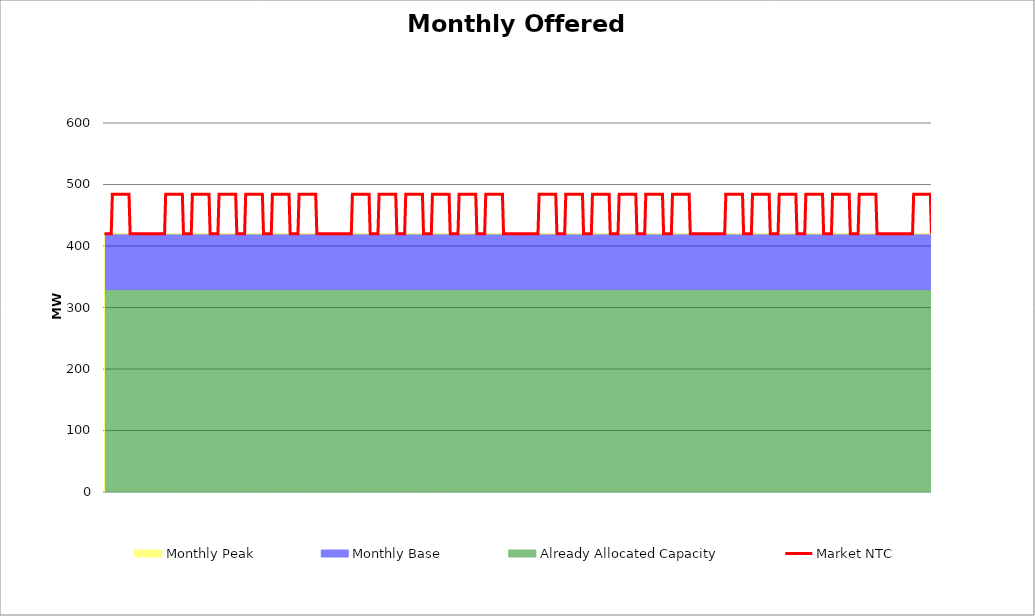
| Category | Market NTC |
|---|---|
| 0 | 420 |
| 1 | 420 |
| 2 | 420 |
| 3 | 420 |
| 4 | 420 |
| 5 | 420 |
| 6 | 420 |
| 7 | 484 |
| 8 | 484 |
| 9 | 484 |
| 10 | 484 |
| 11 | 484 |
| 12 | 484 |
| 13 | 484 |
| 14 | 484 |
| 15 | 484 |
| 16 | 484 |
| 17 | 484 |
| 18 | 484 |
| 19 | 484 |
| 20 | 484 |
| 21 | 484 |
| 22 | 484 |
| 23 | 420 |
| 24 | 420 |
| 25 | 420 |
| 26 | 420 |
| 27 | 420 |
| 28 | 420 |
| 29 | 420 |
| 30 | 420 |
| 31 | 420 |
| 32 | 420 |
| 33 | 420 |
| 34 | 420 |
| 35 | 420 |
| 36 | 420 |
| 37 | 420 |
| 38 | 420 |
| 39 | 420 |
| 40 | 420 |
| 41 | 420 |
| 42 | 420 |
| 43 | 420 |
| 44 | 420 |
| 45 | 420 |
| 46 | 420 |
| 47 | 420 |
| 48 | 420 |
| 49 | 420 |
| 50 | 420 |
| 51 | 420 |
| 52 | 420 |
| 53 | 420 |
| 54 | 420 |
| 55 | 484 |
| 56 | 484 |
| 57 | 484 |
| 58 | 484 |
| 59 | 484 |
| 60 | 484 |
| 61 | 484 |
| 62 | 484 |
| 63 | 484 |
| 64 | 484 |
| 65 | 484 |
| 66 | 484 |
| 67 | 484 |
| 68 | 484 |
| 69 | 484 |
| 70 | 484 |
| 71 | 420 |
| 72 | 420 |
| 73 | 420 |
| 74 | 420 |
| 75 | 420 |
| 76 | 420 |
| 77 | 420 |
| 78 | 420 |
| 79 | 484 |
| 80 | 484 |
| 81 | 484 |
| 82 | 484 |
| 83 | 484 |
| 84 | 484 |
| 85 | 484 |
| 86 | 484 |
| 87 | 484 |
| 88 | 484 |
| 89 | 484 |
| 90 | 484 |
| 91 | 484 |
| 92 | 484 |
| 93 | 484 |
| 94 | 484 |
| 95 | 420 |
| 96 | 420 |
| 97 | 420 |
| 98 | 420 |
| 99 | 420 |
| 100 | 420 |
| 101 | 420 |
| 102 | 420 |
| 103 | 484 |
| 104 | 484 |
| 105 | 484 |
| 106 | 484 |
| 107 | 484 |
| 108 | 484 |
| 109 | 484 |
| 110 | 484 |
| 111 | 484 |
| 112 | 484 |
| 113 | 484 |
| 114 | 484 |
| 115 | 484 |
| 116 | 484 |
| 117 | 484 |
| 118 | 484 |
| 119 | 420 |
| 120 | 420 |
| 121 | 420 |
| 122 | 420 |
| 123 | 420 |
| 124 | 420 |
| 125 | 420 |
| 126 | 420 |
| 127 | 484 |
| 128 | 484 |
| 129 | 484 |
| 130 | 484 |
| 131 | 484 |
| 132 | 484 |
| 133 | 484 |
| 134 | 484 |
| 135 | 484 |
| 136 | 484 |
| 137 | 484 |
| 138 | 484 |
| 139 | 484 |
| 140 | 484 |
| 141 | 484 |
| 142 | 484 |
| 143 | 420 |
| 144 | 420 |
| 145 | 420 |
| 146 | 420 |
| 147 | 420 |
| 148 | 420 |
| 149 | 420 |
| 150 | 420 |
| 151 | 484 |
| 152 | 484 |
| 153 | 484 |
| 154 | 484 |
| 155 | 484 |
| 156 | 484 |
| 157 | 484 |
| 158 | 484 |
| 159 | 484 |
| 160 | 484 |
| 161 | 484 |
| 162 | 484 |
| 163 | 484 |
| 164 | 484 |
| 165 | 484 |
| 166 | 484 |
| 167 | 420 |
| 168 | 420 |
| 169 | 420 |
| 170 | 420 |
| 171 | 420 |
| 172 | 420 |
| 173 | 420 |
| 174 | 420 |
| 175 | 484 |
| 176 | 484 |
| 177 | 484 |
| 178 | 484 |
| 179 | 484 |
| 180 | 484 |
| 181 | 484 |
| 182 | 484 |
| 183 | 484 |
| 184 | 484 |
| 185 | 484 |
| 186 | 484 |
| 187 | 484 |
| 188 | 484 |
| 189 | 484 |
| 190 | 484 |
| 191 | 420 |
| 192 | 420 |
| 193 | 420 |
| 194 | 420 |
| 195 | 420 |
| 196 | 420 |
| 197 | 420 |
| 198 | 420 |
| 199 | 420 |
| 200 | 420 |
| 201 | 420 |
| 202 | 420 |
| 203 | 420 |
| 204 | 420 |
| 205 | 420 |
| 206 | 420 |
| 207 | 420 |
| 208 | 420 |
| 209 | 420 |
| 210 | 420 |
| 211 | 420 |
| 212 | 420 |
| 213 | 420 |
| 214 | 420 |
| 215 | 420 |
| 216 | 420 |
| 217 | 420 |
| 218 | 420 |
| 219 | 420 |
| 220 | 420 |
| 221 | 420 |
| 222 | 420 |
| 223 | 484 |
| 224 | 484 |
| 225 | 484 |
| 226 | 484 |
| 227 | 484 |
| 228 | 484 |
| 229 | 484 |
| 230 | 484 |
| 231 | 484 |
| 232 | 484 |
| 233 | 484 |
| 234 | 484 |
| 235 | 484 |
| 236 | 484 |
| 237 | 484 |
| 238 | 484 |
| 239 | 420 |
| 240 | 420 |
| 241 | 420 |
| 242 | 420 |
| 243 | 420 |
| 244 | 420 |
| 245 | 420 |
| 246 | 420 |
| 247 | 484 |
| 248 | 484 |
| 249 | 484 |
| 250 | 484 |
| 251 | 484 |
| 252 | 484 |
| 253 | 484 |
| 254 | 484 |
| 255 | 484 |
| 256 | 484 |
| 257 | 484 |
| 258 | 484 |
| 259 | 484 |
| 260 | 484 |
| 261 | 484 |
| 262 | 484 |
| 263 | 420 |
| 264 | 420 |
| 265 | 420 |
| 266 | 420 |
| 267 | 420 |
| 268 | 420 |
| 269 | 420 |
| 270 | 420 |
| 271 | 484 |
| 272 | 484 |
| 273 | 484 |
| 274 | 484 |
| 275 | 484 |
| 276 | 484 |
| 277 | 484 |
| 278 | 484 |
| 279 | 484 |
| 280 | 484 |
| 281 | 484 |
| 282 | 484 |
| 283 | 484 |
| 284 | 484 |
| 285 | 484 |
| 286 | 484 |
| 287 | 420 |
| 288 | 420 |
| 289 | 420 |
| 290 | 420 |
| 291 | 420 |
| 292 | 420 |
| 293 | 420 |
| 294 | 420 |
| 295 | 484 |
| 296 | 484 |
| 297 | 484 |
| 298 | 484 |
| 299 | 484 |
| 300 | 484 |
| 301 | 484 |
| 302 | 484 |
| 303 | 484 |
| 304 | 484 |
| 305 | 484 |
| 306 | 484 |
| 307 | 484 |
| 308 | 484 |
| 309 | 484 |
| 310 | 484 |
| 311 | 420 |
| 312 | 420 |
| 313 | 420 |
| 314 | 420 |
| 315 | 420 |
| 316 | 420 |
| 317 | 420 |
| 318 | 420 |
| 319 | 484 |
| 320 | 484 |
| 321 | 484 |
| 322 | 484 |
| 323 | 484 |
| 324 | 484 |
| 325 | 484 |
| 326 | 484 |
| 327 | 484 |
| 328 | 484 |
| 329 | 484 |
| 330 | 484 |
| 331 | 484 |
| 332 | 484 |
| 333 | 484 |
| 334 | 484 |
| 335 | 420 |
| 336 | 420 |
| 337 | 420 |
| 338 | 420 |
| 339 | 420 |
| 340 | 420 |
| 341 | 420 |
| 342 | 420 |
| 343 | 484 |
| 344 | 484 |
| 345 | 484 |
| 346 | 484 |
| 347 | 484 |
| 348 | 484 |
| 349 | 484 |
| 350 | 484 |
| 351 | 484 |
| 352 | 484 |
| 353 | 484 |
| 354 | 484 |
| 355 | 484 |
| 356 | 484 |
| 357 | 484 |
| 358 | 484 |
| 359 | 420 |
| 360 | 420 |
| 361 | 420 |
| 362 | 420 |
| 363 | 420 |
| 364 | 420 |
| 365 | 420 |
| 366 | 420 |
| 367 | 420 |
| 368 | 420 |
| 369 | 420 |
| 370 | 420 |
| 371 | 420 |
| 372 | 420 |
| 373 | 420 |
| 374 | 420 |
| 375 | 420 |
| 376 | 420 |
| 377 | 420 |
| 378 | 420 |
| 379 | 420 |
| 380 | 420 |
| 381 | 420 |
| 382 | 420 |
| 383 | 420 |
| 384 | 420 |
| 385 | 420 |
| 386 | 420 |
| 387 | 420 |
| 388 | 420 |
| 389 | 420 |
| 390 | 420 |
| 391 | 484 |
| 392 | 484 |
| 393 | 484 |
| 394 | 484 |
| 395 | 484 |
| 396 | 484 |
| 397 | 484 |
| 398 | 484 |
| 399 | 484 |
| 400 | 484 |
| 401 | 484 |
| 402 | 484 |
| 403 | 484 |
| 404 | 484 |
| 405 | 484 |
| 406 | 484 |
| 407 | 420 |
| 408 | 420 |
| 409 | 420 |
| 410 | 420 |
| 411 | 420 |
| 412 | 420 |
| 413 | 420 |
| 414 | 420 |
| 415 | 484 |
| 416 | 484 |
| 417 | 484 |
| 418 | 484 |
| 419 | 484 |
| 420 | 484 |
| 421 | 484 |
| 422 | 484 |
| 423 | 484 |
| 424 | 484 |
| 425 | 484 |
| 426 | 484 |
| 427 | 484 |
| 428 | 484 |
| 429 | 484 |
| 430 | 484 |
| 431 | 420 |
| 432 | 420 |
| 433 | 420 |
| 434 | 420 |
| 435 | 420 |
| 436 | 420 |
| 437 | 420 |
| 438 | 420 |
| 439 | 484 |
| 440 | 484 |
| 441 | 484 |
| 442 | 484 |
| 443 | 484 |
| 444 | 484 |
| 445 | 484 |
| 446 | 484 |
| 447 | 484 |
| 448 | 484 |
| 449 | 484 |
| 450 | 484 |
| 451 | 484 |
| 452 | 484 |
| 453 | 484 |
| 454 | 484 |
| 455 | 420 |
| 456 | 420 |
| 457 | 420 |
| 458 | 420 |
| 459 | 420 |
| 460 | 420 |
| 461 | 420 |
| 462 | 420 |
| 463 | 484 |
| 464 | 484 |
| 465 | 484 |
| 466 | 484 |
| 467 | 484 |
| 468 | 484 |
| 469 | 484 |
| 470 | 484 |
| 471 | 484 |
| 472 | 484 |
| 473 | 484 |
| 474 | 484 |
| 475 | 484 |
| 476 | 484 |
| 477 | 484 |
| 478 | 484 |
| 479 | 420 |
| 480 | 420 |
| 481 | 420 |
| 482 | 420 |
| 483 | 420 |
| 484 | 420 |
| 485 | 420 |
| 486 | 420 |
| 487 | 484 |
| 488 | 484 |
| 489 | 484 |
| 490 | 484 |
| 491 | 484 |
| 492 | 484 |
| 493 | 484 |
| 494 | 484 |
| 495 | 484 |
| 496 | 484 |
| 497 | 484 |
| 498 | 484 |
| 499 | 484 |
| 500 | 484 |
| 501 | 484 |
| 502 | 484 |
| 503 | 420 |
| 504 | 420 |
| 505 | 420 |
| 506 | 420 |
| 507 | 420 |
| 508 | 420 |
| 509 | 420 |
| 510 | 420 |
| 511 | 484 |
| 512 | 484 |
| 513 | 484 |
| 514 | 484 |
| 515 | 484 |
| 516 | 484 |
| 517 | 484 |
| 518 | 484 |
| 519 | 484 |
| 520 | 484 |
| 521 | 484 |
| 522 | 484 |
| 523 | 484 |
| 524 | 484 |
| 525 | 484 |
| 526 | 484 |
| 527 | 420 |
| 528 | 420 |
| 529 | 420 |
| 530 | 420 |
| 531 | 420 |
| 532 | 420 |
| 533 | 420 |
| 534 | 420 |
| 535 | 420 |
| 536 | 420 |
| 537 | 420 |
| 538 | 420 |
| 539 | 420 |
| 540 | 420 |
| 541 | 420 |
| 542 | 420 |
| 543 | 420 |
| 544 | 420 |
| 545 | 420 |
| 546 | 420 |
| 547 | 420 |
| 548 | 420 |
| 549 | 420 |
| 550 | 420 |
| 551 | 420 |
| 552 | 420 |
| 553 | 420 |
| 554 | 420 |
| 555 | 420 |
| 556 | 420 |
| 557 | 420 |
| 558 | 420 |
| 559 | 484 |
| 560 | 484 |
| 561 | 484 |
| 562 | 484 |
| 563 | 484 |
| 564 | 484 |
| 565 | 484 |
| 566 | 484 |
| 567 | 484 |
| 568 | 484 |
| 569 | 484 |
| 570 | 484 |
| 571 | 484 |
| 572 | 484 |
| 573 | 484 |
| 574 | 484 |
| 575 | 420 |
| 576 | 420 |
| 577 | 420 |
| 578 | 420 |
| 579 | 420 |
| 580 | 420 |
| 581 | 420 |
| 582 | 420 |
| 583 | 484 |
| 584 | 484 |
| 585 | 484 |
| 586 | 484 |
| 587 | 484 |
| 588 | 484 |
| 589 | 484 |
| 590 | 484 |
| 591 | 484 |
| 592 | 484 |
| 593 | 484 |
| 594 | 484 |
| 595 | 484 |
| 596 | 484 |
| 597 | 484 |
| 598 | 484 |
| 599 | 420 |
| 600 | 420 |
| 601 | 420 |
| 602 | 420 |
| 603 | 420 |
| 604 | 420 |
| 605 | 420 |
| 606 | 420 |
| 607 | 484 |
| 608 | 484 |
| 609 | 484 |
| 610 | 484 |
| 611 | 484 |
| 612 | 484 |
| 613 | 484 |
| 614 | 484 |
| 615 | 484 |
| 616 | 484 |
| 617 | 484 |
| 618 | 484 |
| 619 | 484 |
| 620 | 484 |
| 621 | 484 |
| 622 | 484 |
| 623 | 420 |
| 624 | 420 |
| 625 | 420 |
| 626 | 420 |
| 627 | 420 |
| 628 | 420 |
| 629 | 420 |
| 630 | 420 |
| 631 | 484 |
| 632 | 484 |
| 633 | 484 |
| 634 | 484 |
| 635 | 484 |
| 636 | 484 |
| 637 | 484 |
| 638 | 484 |
| 639 | 484 |
| 640 | 484 |
| 641 | 484 |
| 642 | 484 |
| 643 | 484 |
| 644 | 484 |
| 645 | 484 |
| 646 | 484 |
| 647 | 420 |
| 648 | 420 |
| 649 | 420 |
| 650 | 420 |
| 651 | 420 |
| 652 | 420 |
| 653 | 420 |
| 654 | 420 |
| 655 | 484 |
| 656 | 484 |
| 657 | 484 |
| 658 | 484 |
| 659 | 484 |
| 660 | 484 |
| 661 | 484 |
| 662 | 484 |
| 663 | 484 |
| 664 | 484 |
| 665 | 484 |
| 666 | 484 |
| 667 | 484 |
| 668 | 484 |
| 669 | 484 |
| 670 | 484 |
| 671 | 420 |
| 672 | 420 |
| 673 | 420 |
| 674 | 420 |
| 675 | 420 |
| 676 | 420 |
| 677 | 420 |
| 678 | 420 |
| 679 | 484 |
| 680 | 484 |
| 681 | 484 |
| 682 | 484 |
| 683 | 484 |
| 684 | 484 |
| 685 | 484 |
| 686 | 484 |
| 687 | 484 |
| 688 | 484 |
| 689 | 484 |
| 690 | 484 |
| 691 | 484 |
| 692 | 484 |
| 693 | 484 |
| 694 | 484 |
| 695 | 420 |
| 696 | 420 |
| 697 | 420 |
| 698 | 420 |
| 699 | 420 |
| 700 | 420 |
| 701 | 420 |
| 702 | 420 |
| 703 | 420 |
| 704 | 420 |
| 705 | 420 |
| 706 | 420 |
| 707 | 420 |
| 708 | 420 |
| 709 | 420 |
| 710 | 420 |
| 711 | 420 |
| 712 | 420 |
| 713 | 420 |
| 714 | 420 |
| 715 | 420 |
| 716 | 420 |
| 717 | 420 |
| 718 | 420 |
| 719 | 420 |
| 720 | 420 |
| 721 | 420 |
| 722 | 420 |
| 723 | 420 |
| 724 | 420 |
| 725 | 420 |
| 726 | 420 |
| 727 | 420 |
| 728 | 484 |
| 729 | 484 |
| 730 | 484 |
| 731 | 484 |
| 732 | 484 |
| 733 | 484 |
| 734 | 484 |
| 735 | 484 |
| 736 | 484 |
| 737 | 484 |
| 738 | 484 |
| 739 | 484 |
| 740 | 484 |
| 741 | 484 |
| 742 | 484 |
| 743 | 484 |
| 744 | 420 |